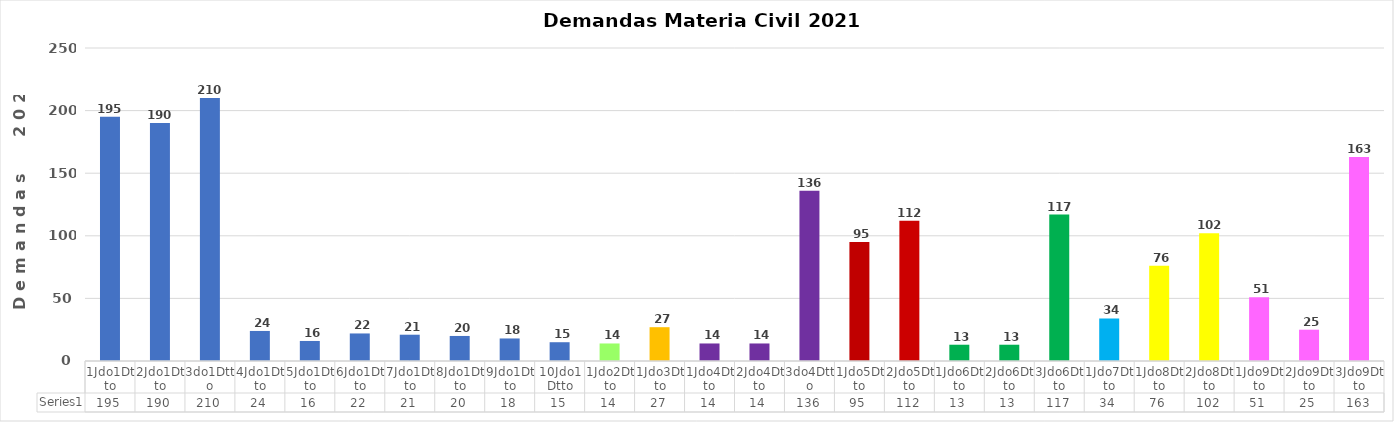
| Category | Series 0 |
|---|---|
| 1Jdo1Dtto | 195 |
| 2Jdo1Dtto | 190 |
| 3do1Dtto | 210 |
| 4Jdo1Dtto | 24 |
| 5Jdo1Dtto | 16 |
| 6Jdo1Dtto | 22 |
| 7Jdo1Dtto | 21 |
| 8Jdo1Dtto | 20 |
| 9Jdo1Dtto | 18 |
| 10Jdo1Dtto | 15 |
| 1Jdo2Dtto | 14 |
| 1Jdo3Dtto | 27 |
| 1Jdo4Dtto | 14 |
| 2Jdo4Dtto | 14 |
| 3do4Dtto | 136 |
| 1Jdo5Dtto | 95 |
| 2Jdo5Dtto | 112 |
| 1Jdo6Dtto | 13 |
| 2Jdo6Dtto | 13 |
| 3Jdo6Dtto | 117 |
| 1Jdo7Dtto | 34 |
| 1Jdo8Dtto | 76 |
| 2Jdo8Dtto | 102 |
| 1Jdo9Dtto | 51 |
| 2Jdo9Dtto | 25 |
| 3Jdo9Dtto | 163 |